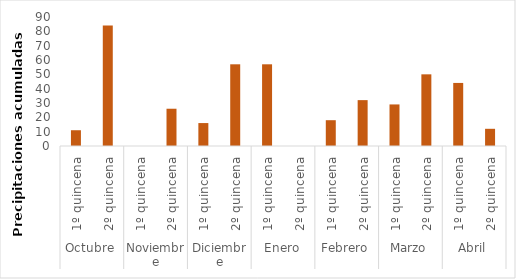
| Category | Series 0 |
|---|---|
| 0 | 11 |
| 1 | 84 |
| 2 | 0 |
| 3 | 26 |
| 4 | 16 |
| 5 | 57 |
| 6 | 57 |
| 7 | 0 |
| 8 | 18 |
| 9 | 32 |
| 10 | 29 |
| 11 | 50 |
| 12 | 44 |
| 13 | 12 |